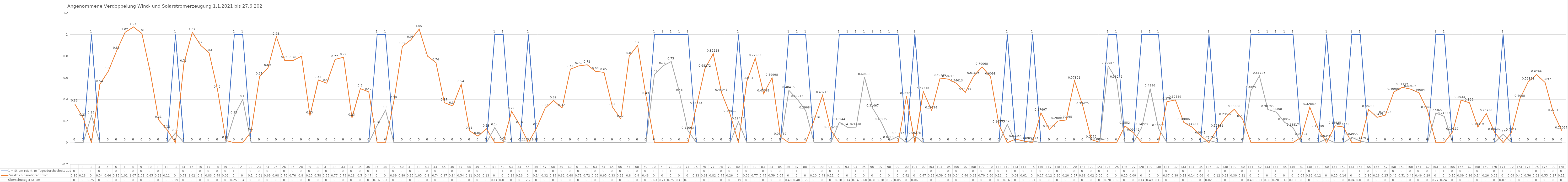
| Category | 1 = Strom reicht im Tagesdurchschnitt aus | Zusätzlich benötigter Strom | Überschüssiger Strom |
|---|---|---|---|
| 0 | 0 | 0.36 | 0 |
| 1 | 0 | 0.23 | 0 |
| 2 | 1 | 0 | 0.25 |
| 3 | 0 | 0.54 | 0 |
| 4 | 0 | 0.66 | 0 |
| 5 | 0 | 0.85 | 0 |
| 6 | 0 | 1.02 | 0 |
| 7 | 0 | 1.07 | 0 |
| 8 | 0 | 1.01 | 0 |
| 9 | 0 | 0.65 | 0 |
| 10 | 0 | 0.21 | 0 |
| 11 | 0 | 0.12 | 0 |
| 12 | 1 | 0 | 0.09 |
| 13 | 0 | 0.73 | 0 |
| 14 | 0 | 1.02 | 0 |
| 15 | 0 | 0.9 | 0 |
| 16 | 0 | 0.83 | 0 |
| 17 | 0 | 0.49 | 0 |
| 18 | 0 | 0.02 | 0 |
| 19 | 1 | 0 | 0.25 |
| 20 | 1 | 0 | 0.4 |
| 21 | 0 | 0.1 | 0 |
| 22 | 0 | 0.61 | 0 |
| 23 | 0 | 0.69 | 0 |
| 24 | 0 | 0.98 | 0 |
| 25 | 0 | 0.76 | 0 |
| 26 | 0 | 0.76 | 0 |
| 27 | 0 | 0.8 | 0 |
| 28 | 0 | 0.25 | 0 |
| 29 | 0 | 0.58 | 0 |
| 30 | 0 | 0.55 | 0 |
| 31 | 0 | 0.77 | 0 |
| 32 | 0 | 0.79 | 0 |
| 33 | 0 | 0.23 | 0 |
| 34 | 0 | 0.5 | 0 |
| 35 | 0 | 0.47 | 0 |
| 36 | 1 | 0 | 0.16 |
| 37 | 1 | 0 | 0.3 |
| 38 | 0 | 0.39 | 0 |
| 39 | 0 | 0.89 | 0 |
| 40 | 0 | 0.95 | 0 |
| 41 | 0 | 1.05 | 0 |
| 42 | 0 | 0.8 | 0 |
| 43 | 0 | 0.74 | 0 |
| 44 | 0 | 0.37 | 0 |
| 45 | 0 | 0.34 | 0 |
| 46 | 0 | 0.54 | 0 |
| 47 | 0 | 0.11 | 0 |
| 48 | 0 | 0.06 | 0 |
| 49 | 0 | 0.13 | 0 |
| 50 | 1 | 0 | 0.14 |
| 51 | 1 | 0 | 0.01 |
| 52 | 0 | 0.29 | 0 |
| 53 | 0 | 0.16 | 0 |
| 54 | 1 | 0 | 0 |
| 55 | 0 | 0.14 | 0 |
| 56 | 0 | 0.32 | 0 |
| 57 | 0 | 0.39 | 0 |
| 58 | 0 | 0.32 | 0 |
| 59 | 0 | 0.68 | 0 |
| 60 | 0 | 0.71 | 0 |
| 61 | 0 | 0.72 | 0 |
| 62 | 0 | 0.66 | 0 |
| 63 | 0 | 0.65 | 0 |
| 64 | 0 | 0.33 | 0 |
| 65 | 0 | 0.22 | 0 |
| 66 | 0 | 0.8 | 0 |
| 67 | 0 | 0.9 | 0 |
| 68 | 0 | 0.43 | 0 |
| 69 | 1 | 0 | 0.63 |
| 70 | 1 | 0 | 0.71 |
| 71 | 1 | 0 | 0.75 |
| 72 | 1 | 0 | 0.46 |
| 73 | 1 | 0 | 0.11 |
| 74 | 0 | 0.335 | 0 |
| 75 | 0 | 0.683 | 0 |
| 76 | 0 | 0.822 | 0 |
| 77 | 0 | 0.459 | 0 |
| 78 | 0 | 0.265 | 0 |
| 79 | 1 | 0 | 0.195 |
| 80 | 0 | 0.568 | 0 |
| 81 | 0 | 0.78 | 0 |
| 82 | 0 | 0.454 | 0 |
| 83 | 0 | 0.6 | 0 |
| 84 | 0 | 0.055 | 0 |
| 85 | 1 | 0 | 0.484 |
| 86 | 1 | 0 | 0.402 |
| 87 | 1 | 0 | 0.297 |
| 88 | 0 | 0.206 | 0 |
| 89 | 0 | 0.437 | 0 |
| 90 | 0 | 0.115 | 0 |
| 91 | 1 | 0 | 0.189 |
| 92 | 1 | 0 | 0.142 |
| 93 | 1 | 0 | 0.144 |
| 94 | 1 | 0 | 0.606 |
| 95 | 1 | 0 | 0.315 |
| 96 | 1 | 0 | 0.189 |
| 97 | 1 | 0 | 0.021 |
| 98 | 1 | 0 | 0.059 |
| 99 | 0 | 0.428 | 0 |
| 100 | 1 | 0 | 0.063 |
| 101 | 0 | 0.473 | 0 |
| 102 | 0 | 0.298 | 0 |
| 103 | 0 | 0.597 | 0 |
| 104 | 0 | 0.587 | 0 |
| 105 | 0 | 0.546 | 0 |
| 106 | 0 | 0.465 | 0 |
| 107 | 0 | 0.616 | 0 |
| 108 | 0 | 0.701 | 0 |
| 109 | 0 | 0.61 | 0 |
| 110 | 0 | 0.166 | 0 |
| 111 | 1 | 0 | 0.17 |
| 112 | 0 | 0.034 | 0 |
| 113 | 0 | 0.014 | 0 |
| 114 | 1 | 0 | 0.016 |
| 115 | 0 | 0.277 | 0 |
| 116 | 0 | 0.123 | 0 |
| 117 | 0 | 0.2 | 0 |
| 118 | 0 | 0.21 | 0 |
| 119 | 0 | 0.573 | 0 |
| 120 | 0 | 0.335 | 0 |
| 121 | 0 | 0.028 | 0 |
| 122 | 0 | 0.003 | 0 |
| 123 | 1 | 0 | 0.71 |
| 124 | 1 | 0 | 0.582 |
| 125 | 0 | 0.155 | 0 |
| 126 | 0 | 0.092 | 0 |
| 127 | 1 | 0 | 0.142 |
| 128 | 1 | 0 | 0.5 |
| 129 | 1 | 0 | 0.131 |
| 130 | 0 | 0.379 | 0 |
| 131 | 0 | 0.395 | 0 |
| 132 | 0 | 0.188 | 0 |
| 133 | 0 | 0.143 | 0 |
| 134 | 0 | 0.064 | 0 |
| 135 | 1 | 0 | 0.021 |
| 136 | 0 | 0.129 | 0 |
| 137 | 0 | 0.236 | 0 |
| 138 | 0 | 0.309 | 0 |
| 139 | 0 | 0.217 | 0 |
| 140 | 1 | 0 | 0.482 |
| 141 | 1 | 0 | 0.617 |
| 142 | 1 | 0 | 0.307 |
| 143 | 1 | 0 | 0.283 |
| 144 | 1 | 0 | 0.189 |
| 145 | 1 | 0 | 0.138 |
| 146 | 0 | 0.052 | 0 |
| 147 | 0 | 0.329 | 0 |
| 148 | 0 | 0.128 | 0 |
| 149 | 1 | 0 | 0.035 |
| 150 | 0 | 0.156 | 0 |
| 151 | 0 | 0.146 | 0 |
| 152 | 1 | 0 | 0.05 |
| 153 | 1 | 0 | 0.014 |
| 154 | 0 | 0.307 | 0 |
| 155 | 0 | 0.234 | 0 |
| 156 | 0 | 0.255 | 0 |
| 157 | 0 | 0.469 | 0 |
| 158 | 0 | 0.512 | 0 |
| 159 | 0 | 0.495 | 0 |
| 160 | 0 | 0.461 | 0 |
| 161 | 0 | 0.3 | 0 |
| 162 | 1 | 0 | 0.274 |
| 163 | 1 | 0 | 0.243 |
| 164 | 0 | 0.101 | 0 |
| 165 | 0 | 0.393 | 0 |
| 166 | 0 | 0.369 | 0 |
| 167 | 0 | 0.144 | 0 |
| 168 | 0 | 0.27 | 0 |
| 169 | 0 | 0.095 | 0 |
| 170 | 1 | 0 | 0.077 |
| 171 | 0 | 0.095 | 0 |
| 172 | 0 | 0.406 | 0 |
| 173 | 0 | 0.563 | 0 |
| 174 | 0 | 0.63 | 0 |
| 175 | 0 | 0.556 | 0 |
| 176 | 0 | 0.273 | 0 |
| 177 | 0 | 0.11 | 0 |